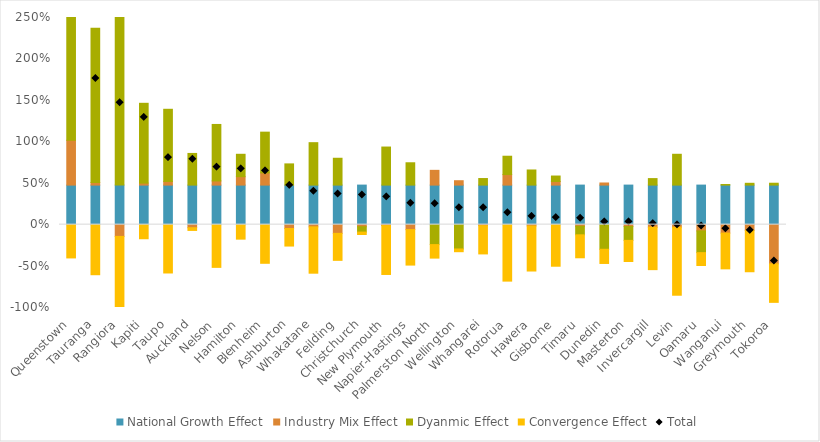
| Category | National Growth Effect | Industry Mix Effect | Dyanmic Effect | Convergence Effect |
|---|---|---|---|---|
| Queenstown | 0.477 | 0.541 | 2.994 | -0.402 |
| Tauranga | 0.477 | 0.03 | 1.861 | -0.604 |
| Rangiora | 0.477 | -0.142 | 2.042 | -0.905 |
| Kapiti | 0.477 | 0.024 | 0.963 | -0.17 |
| Taupo | 0.477 | 0.044 | 0.871 | -0.583 |
| Auckland | 0.477 | -0.037 | 0.382 | -0.033 |
| Nelson | 0.477 | 0.05 | 0.682 | -0.516 |
| Hamilton | 0.477 | 0.102 | 0.27 | -0.175 |
| Blenheim | 0.477 | 0.147 | 0.492 | -0.466 |
| Ashburton | 0.477 | -0.047 | 0.256 | -0.212 |
| Whakatane | 0.477 | -0.027 | 0.512 | -0.559 |
| Feilding | 0.477 | -0.105 | 0.324 | -0.326 |
| Christchurch | 0.477 | -0.025 | -0.065 | -0.029 |
| New Plymouth | 0.477 | -0.011 | 0.459 | -0.59 |
| Napier-Hastings | 0.477 | -0.06 | 0.269 | -0.428 |
| Palmerston North | 0.477 | 0.178 | -0.241 | -0.163 |
| Wellington | 0.477 | 0.053 | -0.294 | -0.033 |
| Whangarei | 0.477 | -0.012 | 0.079 | -0.342 |
| Rotorua | 0.477 | 0.127 | 0.221 | -0.682 |
| Hawera | 0.477 | -0.016 | 0.182 | -0.544 |
| Gisborne | 0.477 | 0.044 | 0.066 | -0.502 |
| Timaru | 0.477 | -0.02 | -0.103 | -0.277 |
| Dunedin | 0.477 | 0.026 | -0.297 | -0.171 |
| Masterton | 0.477 | -0.023 | -0.167 | -0.255 |
| Invercargill | 0.477 | -0.031 | 0.078 | -0.512 |
| Levin | 0.477 | -0.031 | 0.372 | -0.821 |
| Oamaru | 0.477 | -0.076 | -0.262 | -0.156 |
| Wanganui | 0.477 | -0.102 | 0.008 | -0.431 |
| Greymouth | 0.477 | -0.07 | 0.022 | -0.499 |
| Tokoroa | 0.477 | -0.473 | 0.023 | -0.465 |